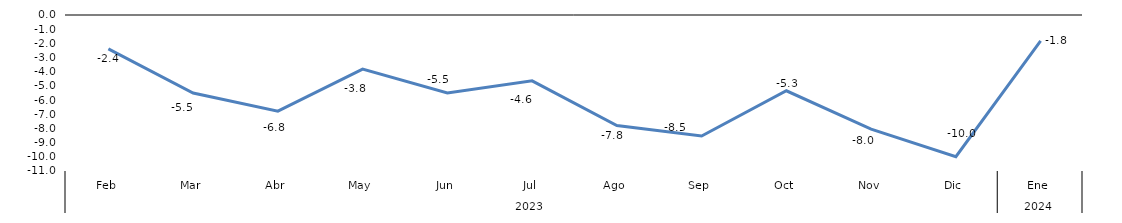
| Category | Series 0 |
|---|---|
| 0 | -2.385 |
| 1 | -5.499 |
| 2 | -6.782 |
| 3 | -3.813 |
| 4 | -5.504 |
| 5 | -4.641 |
| 6 | -7.799 |
| 7 | -8.536 |
| 8 | -5.344 |
| 9 | -8.049 |
| 10 | -9.991 |
| 11 | -1.819 |